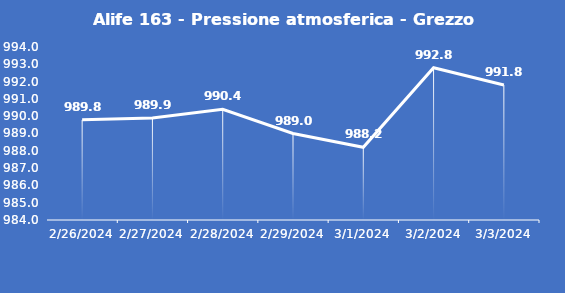
| Category | Alife 163 - Pressione atmosferica - Grezzo (hPa) |
|---|---|
| 2/26/24 | 989.8 |
| 2/27/24 | 989.9 |
| 2/28/24 | 990.4 |
| 2/29/24 | 989 |
| 3/1/24 | 988.2 |
| 3/2/24 | 992.8 |
| 3/3/24 | 991.8 |